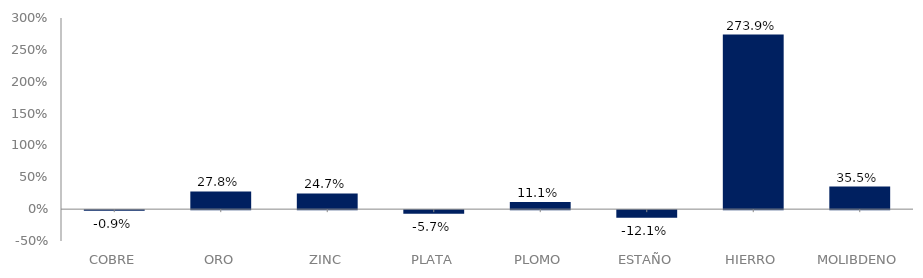
| Category | Series 0 |
|---|---|
| COBRE | -0.009 |
| ORO | 0.278 |
| ZINC | 0.247 |
| PLATA | -0.057 |
| PLOMO | 0.111 |
| ESTAÑO | -0.121 |
| HIERRO | 2.739 |
| MOLIBDENO | 0.355 |